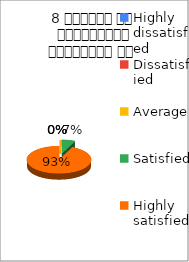
| Category | 8 शिक्षक का सम्प्रेषण सुस्पष्ठ है  |
|---|---|
| Highly dissatisfied | 0 |
| Dissatisfied | 0 |
| Average | 0 |
| Satisfied | 1 |
| Highly satisfied | 14 |